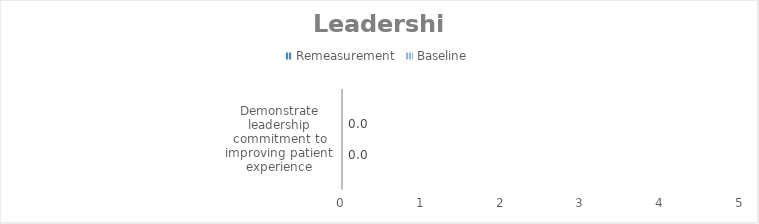
| Category | Remeasurement | Baseline |
|---|---|---|
| Demonstrate leadership commitment to improving patient experience | 0 | 0 |